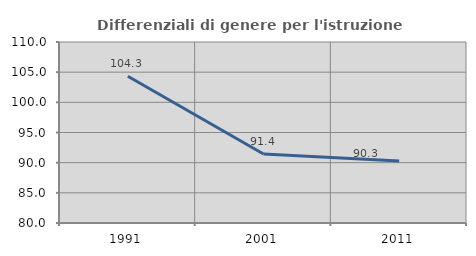
| Category | Differenziali di genere per l'istruzione superiore |
|---|---|
| 1991.0 | 104.328 |
| 2001.0 | 91.44 |
| 2011.0 | 90.281 |